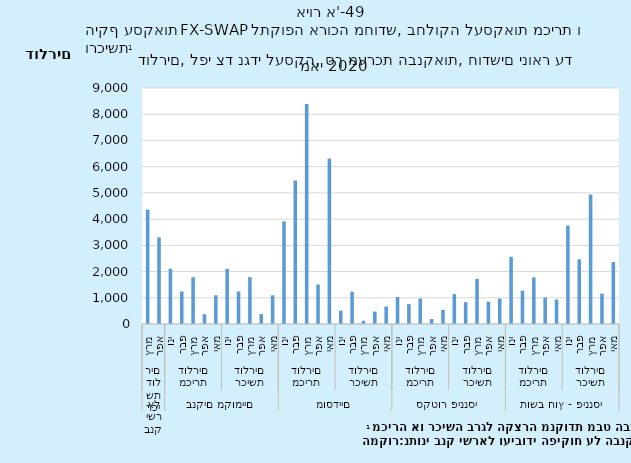
| Category | Series 0 |
|---|---|
| 0 | 4361293222.215 |
| 1 | 3303734773.341 |
| 2 | 2106276116.129 |
| 3 | 1240061912.415 |
| 4 | 1785139889.928 |
| 5 | 375356773.249 |
| 6 | 1094536605.709 |
| 7 | 2106276116.129 |
| 8 | 1240061912.415 |
| 9 | 1785138012.246 |
| 10 | 375356773.249 |
| 11 | 1094536605.709 |
| 12 | 3913047763.458 |
| 13 | 5472141573.38 |
| 14 | 8389311363.449 |
| 15 | 1508189698.949 |
| 16 | 6307972446.486 |
| 17 | 509202459.719 |
| 18 | 1231736949.869 |
| 19 | 123553930.127 |
| 20 | 473987127.896 |
| 21 | 667954109.166 |
| 22 | 1033170493.151 |
| 23 | 758584139.092 |
| 24 | 970144087.428 |
| 25 | 189263529.144 |
| 26 | 541022618.987 |
| 27 | 1140949749.45 |
| 28 | 829873391.339 |
| 29 | 1719039333.154 |
| 30 | 850981246.949 |
| 31 | 969296989.303 |
| 32 | 2562650097.164 |
| 33 | 1271732195.576 |
| 34 | 1778891484.859 |
| 35 | 1009531763.582 |
| 36 | 935382080.918 |
| 37 | 3755183745.623 |
| 38 | 2468193062.064 |
| 39 | 4934212727.487 |
| 40 | 1157606833.237 |
| 41 | 2366308627.379 |